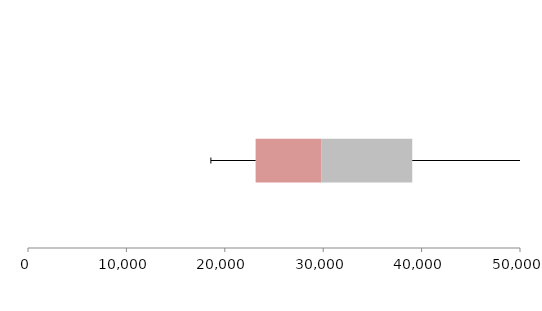
| Category | Series 1 | Series 2 | Series 3 |
|---|---|---|---|
| 0 | 23131.541 | 6705.84 | 9212.77 |